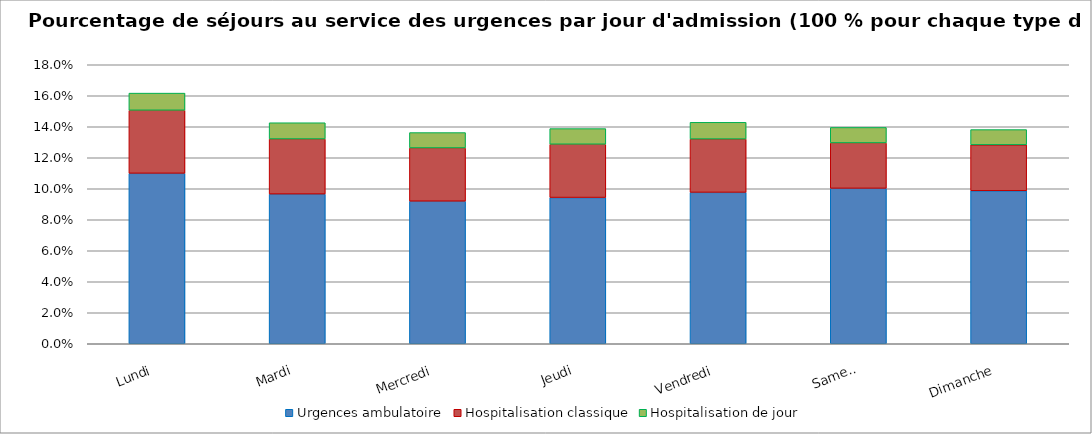
| Category | Urgences ambulatoire | Hospitalisation classique | Hospitalisation de jour |
|---|---|---|---|
| Lundi | 0.11 | 0.041 | 0.011 |
| Mardi | 0.097 | 0.036 | 0.01 |
| Mercredi | 0.092 | 0.034 | 0.01 |
| Jeudi | 0.094 | 0.034 | 0.01 |
| Vendredi | 0.098 | 0.034 | 0.011 |
| Samedi | 0.1 | 0.029 | 0.01 |
| Dimanche | 0.099 | 0.03 | 0.01 |